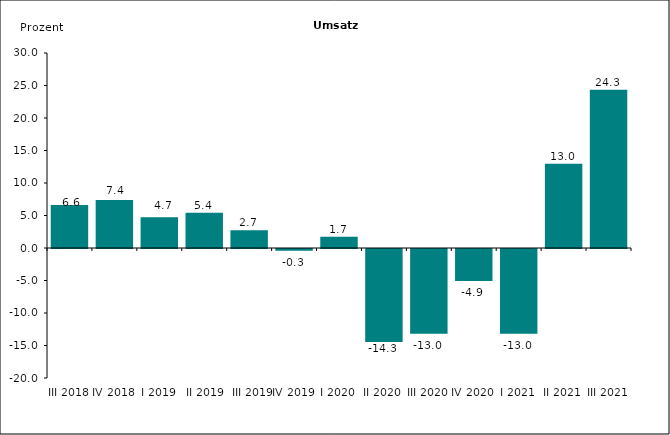
| Category | Series 0 |
|---|---|
| III 2018 | 6.6 |
| IV 2018 | 7.4 |
| I 2019 | 4.714 |
|  II 2019 | 5.422 |
|  III 2019 | 2.73 |
| IV 2019 | -0.265 |
| I 2020 | 1.721 |
| II 2020 | -14.324 |
| III 2020 | -13.033 |
| IV 2020 | -4.938 |
| I 2021 | -13.038 |
| II 2021 | 12.95 |
| III 2021 | 24.338 |